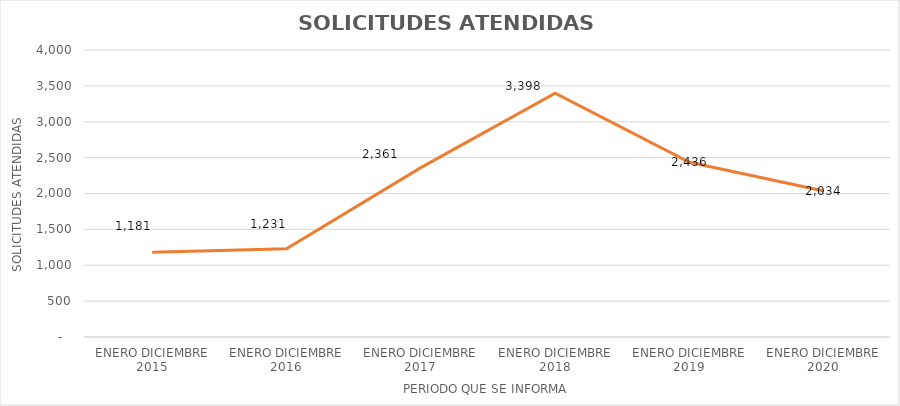
| Category | Series 0 |
|---|---|
| ENERO DICIEMBRE 2015 | 1181 |
| ENERO DICIEMBRE 2016 | 1231 |
| ENERO DICIEMBRE 2017 | 2361 |
| ENERO DICIEMBRE 2018 | 3398 |
| ENERO DICIEMBRE 2019 | 2436 |
| ENERO DICIEMBRE 2020 | 2034 |